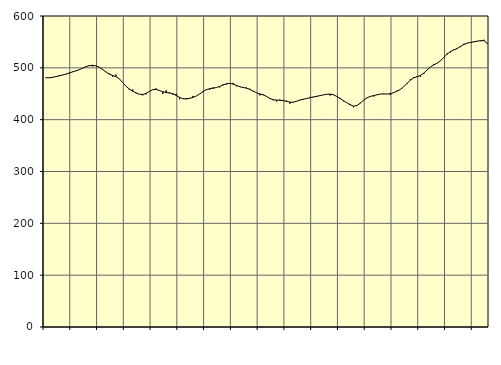
| Category | Piggar | Series 1 |
|---|---|---|
| nan | 480.3 | 480.8 |
| 87.0 | 480.5 | 480.75 |
| 87.0 | 482.5 | 481.49 |
| 87.0 | 482.3 | 483.02 |
| nan | 485.6 | 484.6 |
| 88.0 | 485.9 | 486.1 |
| 88.0 | 487.1 | 487.77 |
| 88.0 | 490.5 | 489.87 |
| nan | 492.6 | 492.14 |
| 89.0 | 493.8 | 494.07 |
| 89.0 | 496.4 | 496.28 |
| 89.0 | 499 | 499.15 |
| nan | 502.5 | 502.1 |
| 90.0 | 503.6 | 504.16 |
| 90.0 | 502.8 | 504.78 |
| 90.0 | 504.2 | 503.87 |
| nan | 501.3 | 501.18 |
| 91.0 | 497.9 | 496.98 |
| 91.0 | 492.7 | 492.05 |
| 91.0 | 489.1 | 487.88 |
| nan | 482.9 | 485.37 |
| 92.0 | 486.9 | 483.03 |
| 92.0 | 478.5 | 478.78 |
| 92.0 | 472 | 471.93 |
| nan | 464.7 | 464.64 |
| 93.0 | 457.4 | 459.09 |
| 93.0 | 458.4 | 455 |
| 93.0 | 451 | 451.74 |
| nan | 449.1 | 449.03 |
| 94.0 | 447 | 448.38 |
| 94.0 | 448.8 | 450.68 |
| 94.0 | 455.3 | 454.5 |
| nan | 457.6 | 457.9 |
| 95.0 | 460.3 | 458.4 |
| 95.0 | 457 | 456.24 |
| 95.0 | 449.7 | 453.9 |
| nan | 456.4 | 452.33 |
| 96.0 | 450.5 | 451.67 |
| 96.0 | 448.2 | 450.16 |
| 96.0 | 449.8 | 446.8 |
| nan | 439.4 | 443.11 |
| 97.0 | 441.3 | 440.37 |
| 97.0 | 441.7 | 439.96 |
| 97.0 | 440.1 | 441.18 |
| nan | 445.8 | 442.87 |
| 98.0 | 445.6 | 445.59 |
| 98.0 | 449.7 | 449.51 |
| 98.0 | 455.1 | 453.93 |
| nan | 458.7 | 457.76 |
| 99.0 | 457.6 | 459.71 |
| 99.0 | 462.3 | 460.67 |
| 99.0 | 462 | 461.98 |
| nan | 462.1 | 464.2 |
| 0.0 | 468.2 | 466.81 |
| 0.0 | 468 | 469.2 |
| 0.0 | 469.1 | 470.01 |
| nan | 471 | 468.73 |
| 1.0 | 464.3 | 466.13 |
| 1.0 | 464.6 | 463.54 |
| 1.0 | 462.7 | 462.09 |
| nan | 462.2 | 460.71 |
| 2.0 | 459.7 | 458.42 |
| 2.0 | 454.4 | 455.12 |
| 2.0 | 451.9 | 451.87 |
| nan | 446.8 | 449.71 |
| 3.0 | 449.2 | 447.92 |
| 3.0 | 445.3 | 444.98 |
| 3.0 | 440.4 | 441.01 |
| nan | 437.6 | 438.41 |
| 4.0 | 435 | 437.69 |
| 4.0 | 438.6 | 437.55 |
| 4.0 | 435.7 | 436.87 |
| nan | 436.8 | 435.29 |
| 5.0 | 430.8 | 433.82 |
| 5.0 | 432.7 | 433.72 |
| 5.0 | 435.3 | 435.51 |
| nan | 438.2 | 437.81 |
| 6.0 | 438.1 | 439.36 |
| 6.0 | 440.4 | 440.75 |
| 6.0 | 444 | 442.36 |
| nan | 443 | 443.87 |
| 7.0 | 443.6 | 445.15 |
| 7.0 | 445.8 | 446.34 |
| 7.0 | 447.6 | 447.76 |
| nan | 449.2 | 448.97 |
| 8.0 | 446.5 | 449.27 |
| 8.0 | 447.5 | 448.02 |
| 8.0 | 444.5 | 444.87 |
| nan | 442 | 440.78 |
| 9.0 | 435.5 | 436.61 |
| 9.0 | 432.6 | 432.68 |
| 9.0 | 430.5 | 428.74 |
| nan | 423.8 | 426.16 |
| 10.0 | 426.7 | 427.13 |
| 10.0 | 432.5 | 431.69 |
| 10.0 | 437.6 | 437.37 |
| nan | 442.3 | 441.95 |
| 11.0 | 445.6 | 444.8 |
| 11.0 | 444.6 | 446.51 |
| 11.0 | 448.2 | 447.89 |
| nan | 449.4 | 449.35 |
| 12.0 | 449.1 | 449.78 |
| 12.0 | 449.3 | 449.42 |
| 12.0 | 447.4 | 450.03 |
| nan | 453.1 | 452.1 |
| 13.0 | 455.9 | 455.05 |
| 13.0 | 457.9 | 458.33 |
| 13.0 | 463.3 | 463.39 |
| nan | 469 | 470.02 |
| 14.0 | 477.9 | 476.2 |
| 14.0 | 482.1 | 480.63 |
| 14.0 | 484 | 482.93 |
| nan | 482.9 | 485.28 |
| 15.0 | 487.9 | 489.71 |
| 15.0 | 496.3 | 496.03 |
| 15.0 | 501.6 | 501.72 |
| nan | 507.3 | 505.61 |
| 16.0 | 509.1 | 508.96 |
| 16.0 | 513.2 | 513.73 |
| 16.0 | 520.4 | 520.08 |
| nan | 528.6 | 526.65 |
| 17.0 | 529.7 | 531.53 |
| 17.0 | 535.4 | 534.48 |
| 17.0 | 536.2 | 537.39 |
| nan | 539.9 | 541.36 |
| 18.0 | 546.5 | 545.06 |
| 18.0 | 547.3 | 547.64 |
| 18.0 | 548.4 | 549.06 |
| nan | 550.8 | 550.07 |
| 19.0 | 551.9 | 551.45 |
| 19.0 | 551.4 | 552.4 |
| 19.0 | 554.2 | 552.59 |
| nan | 545.9 | 547.21 |